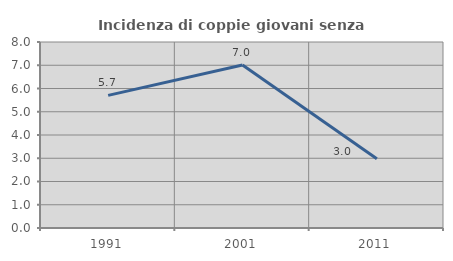
| Category | Incidenza di coppie giovani senza figli |
|---|---|
| 1991.0 | 5.704 |
| 2001.0 | 7.009 |
| 2011.0 | 2.981 |